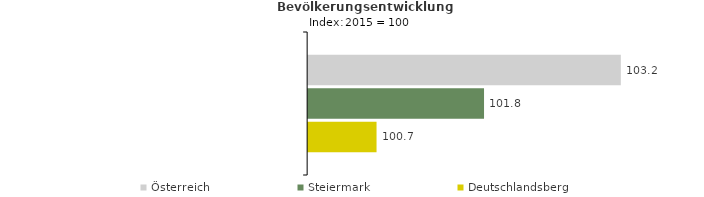
| Category | Österreich | Steiermark | Deutschlandsberg |
|---|---|---|---|
| 2019.0 | 103.2 | 101.8 | 100.7 |